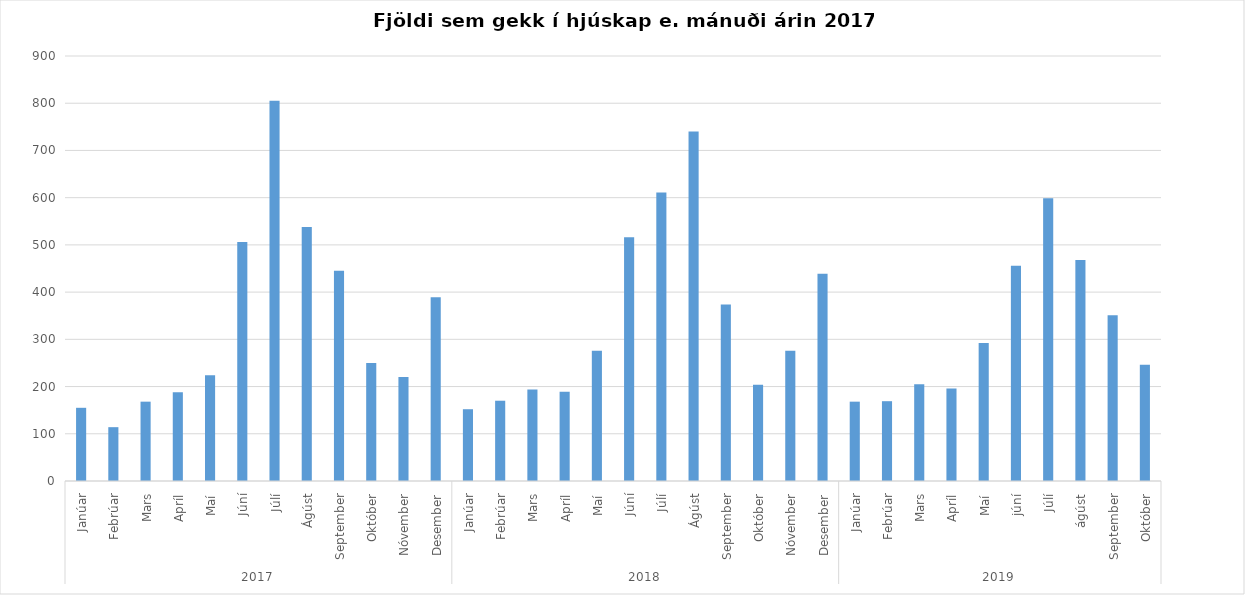
| Category | Series 0 |
|---|---|
| 0 | 155 |
| 1 | 114 |
| 2 | 168 |
| 3 | 188 |
| 4 | 224 |
| 5 | 506 |
| 6 | 805 |
| 7 | 538 |
| 8 | 445 |
| 9 | 250 |
| 10 | 220 |
| 11 | 389 |
| 12 | 152 |
| 13 | 170 |
| 14 | 194 |
| 15 | 189 |
| 16 | 276 |
| 17 | 516 |
| 18 | 611 |
| 19 | 740 |
| 20 | 374 |
| 21 | 204 |
| 22 | 276 |
| 23 | 439 |
| 24 | 168 |
| 25 | 169 |
| 26 | 205 |
| 27 | 196 |
| 28 | 292 |
| 29 | 456 |
| 30 | 599 |
| 31 | 468 |
| 32 | 351 |
| 33 | 246 |